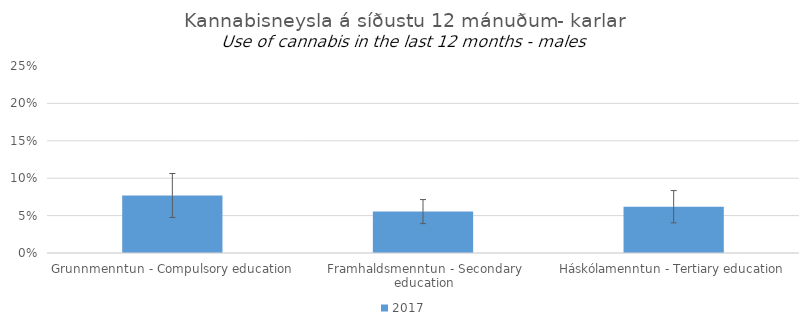
| Category | 2017 |
|---|---|
| Grunnmenntun - Compulsory education | 0.077 |
| Framhaldsmenntun - Secondary education | 0.055 |
| Háskólamenntun - Tertiary education | 0.062 |